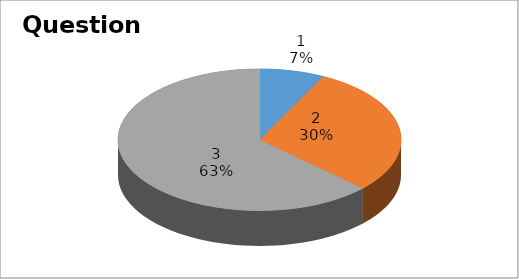
| Category | Series 0 |
|---|---|
| 0 | 4 |
| 1 | 16 |
| 2 | 34 |